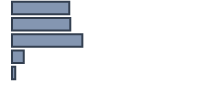
| Category | Percentatge |
|---|---|
| 0 | 28.5 |
| 1 | 29 |
| 2 | 35 |
| 3 | 5.9 |
| 4 | 1.6 |